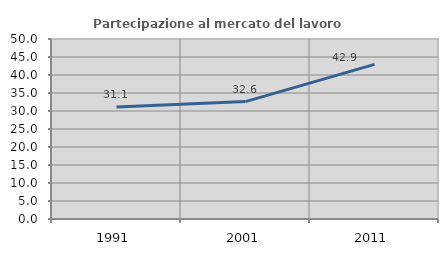
| Category | Partecipazione al mercato del lavoro  femminile |
|---|---|
| 1991.0 | 31.143 |
| 2001.0 | 32.618 |
| 2011.0 | 42.939 |